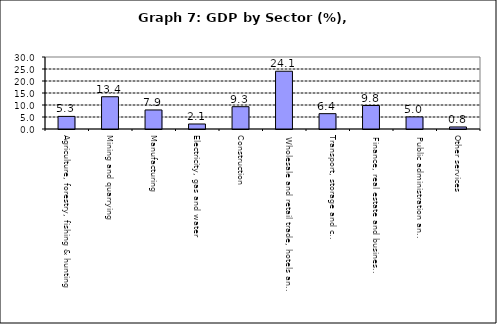
| Category | Series 0 |
|---|---|
| Agriculture, forestry, fishing & hunting | 5.251 |
| Mining and quarrying  | 13.443 |
| Manufacturing | 7.93 |
| Electricity, gas and water | 2.087 |
| Construction | 9.296 |
| Wholesale and retail trade, hotels and restaurants  | 24.073 |
| Transport, storage and communication                | 6.393 |
| Finance, real estate and business services          | 9.79 |
| Public administration and Defense                       | 5.03 |
| Other services                                    | 0.848 |